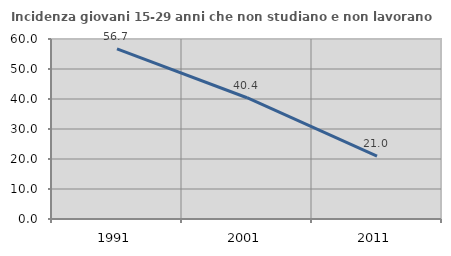
| Category | Incidenza giovani 15-29 anni che non studiano e non lavorano  |
|---|---|
| 1991.0 | 56.725 |
| 2001.0 | 40.426 |
| 2011.0 | 20.988 |